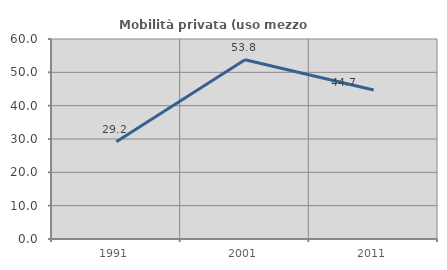
| Category | Mobilità privata (uso mezzo privato) |
|---|---|
| 1991.0 | 29.193 |
| 2001.0 | 53.788 |
| 2011.0 | 44.715 |